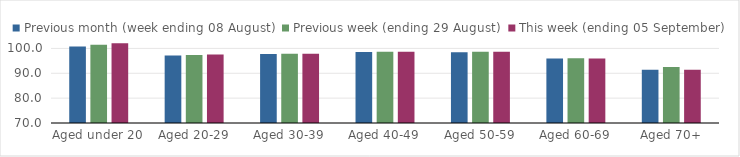
| Category | Previous month (week ending 08 August) | Previous week (ending 29 August) | This week (ending 05 September) |
|---|---|---|---|
| Aged under 20 | 100.81 | 101.44 | 102.09 |
| Aged 20-29 | 97.17 | 97.4 | 97.58 |
| Aged 30-39 | 97.77 | 97.9 | 97.87 |
| Aged 40-49 | 98.53 | 98.66 | 98.65 |
| Aged 50-59 | 98.5 | 98.62 | 98.7 |
| Aged 60-69 | 95.9 | 96.06 | 95.95 |
| Aged 70+ | 91.47 | 92.5 | 91.39 |